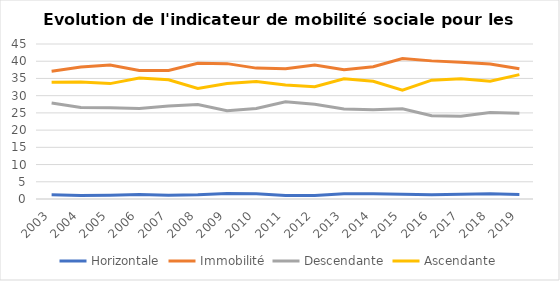
| Category | Horizontale | Immobilité | Descendante | Ascendante |
|---|---|---|---|---|
| 2003.0 | 1.2 | 37.1 | 27.9 | 33.9 |
| 2004.0 | 1 | 38.3 | 26.6 | 34 |
| 2005.0 | 1.1 | 38.9 | 26.5 | 33.5 |
| 2006.0 | 1.3 | 37.3 | 26.3 | 35.1 |
| 2007.0 | 1.1 | 37.3 | 27 | 34.6 |
| 2008.0 | 1.2 | 39.4 | 27.4 | 32.1 |
| 2009.0 | 1.6 | 39.3 | 25.6 | 33.5 |
| 2010.0 | 1.5 | 38 | 26.3 | 34.1 |
| 2011.0 | 1 | 37.8 | 28.2 | 33.1 |
| 2012.0 | 1 | 38.9 | 27.5 | 32.6 |
| 2013.0 | 1.5 | 37.5 | 26.1 | 34.9 |
| 2014.0 | 1.5 | 38.4 | 25.9 | 34.2 |
| 2015.0 | 1.4 | 40.8 | 26.2 | 31.6 |
| 2016.0 | 1.2 | 40.1 | 24.2 | 34.5 |
| 2017.0 | 1.4 | 39.7 | 24 | 34.9 |
| 2018.0 | 1.5 | 39.2 | 25.1 | 34.2 |
| 2019.0 | 1.3 | 37.8 | 24.9 | 36.1 |